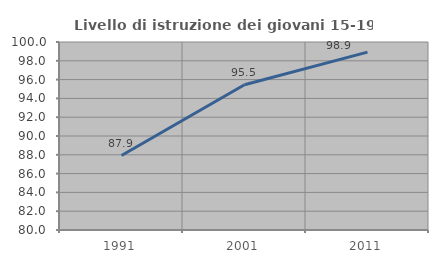
| Category | Livello di istruzione dei giovani 15-19 anni |
|---|---|
| 1991.0 | 87.919 |
| 2001.0 | 95.455 |
| 2011.0 | 98.925 |